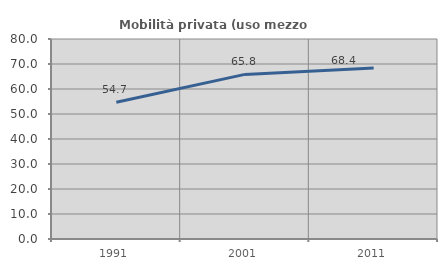
| Category | Mobilità privata (uso mezzo privato) |
|---|---|
| 1991.0 | 54.681 |
| 2001.0 | 65.841 |
| 2011.0 | 68.418 |